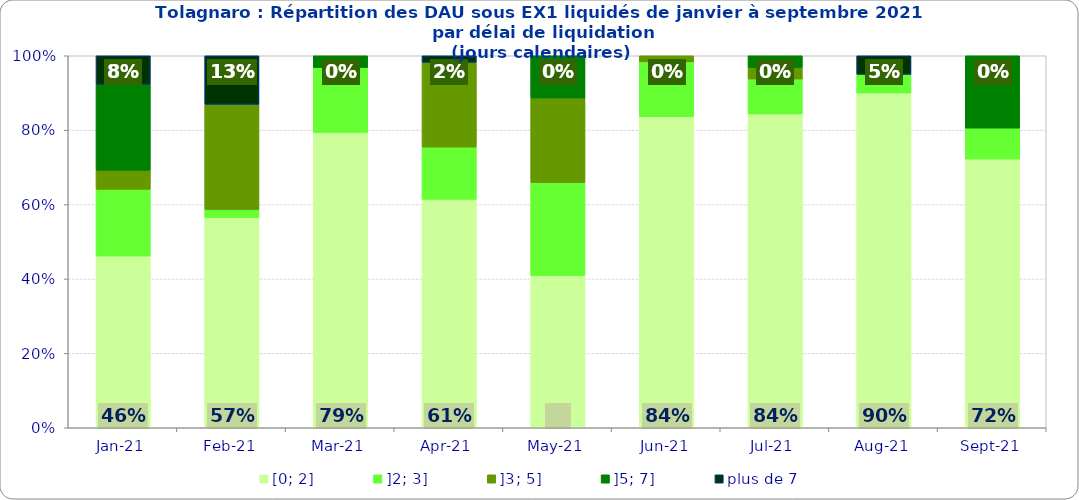
| Category | [0; 2] | ]2; 3] | ]3; 5] | ]5; 7] | plus de 7 |
|---|---|---|---|---|---|
| 2021-01-01 | 0.462 | 0.179 | 0.051 | 0.231 | 0.077 |
| 2021-02-01 | 0.565 | 0.022 | 0.283 | 0 | 0.13 |
| 2021-03-01 | 0.794 | 0.175 | 0 | 0.032 | 0 |
| 2021-04-01 | 0.614 | 0.14 | 0.228 | 0 | 0.018 |
| 2021-05-01 | 0.409 | 0.25 | 0.227 | 0.114 | 0 |
| 2021-06-01 | 0.836 | 0.148 | 0.016 | 0 | 0 |
| 2021-07-01 | 0.844 | 0.094 | 0.031 | 0.031 | 0 |
| 2021-08-01 | 0.9 | 0.05 | 0 | 0 | 0.05 |
| 2021-09-01 | 0.722 | 0.083 | 0 | 0.194 | 0 |